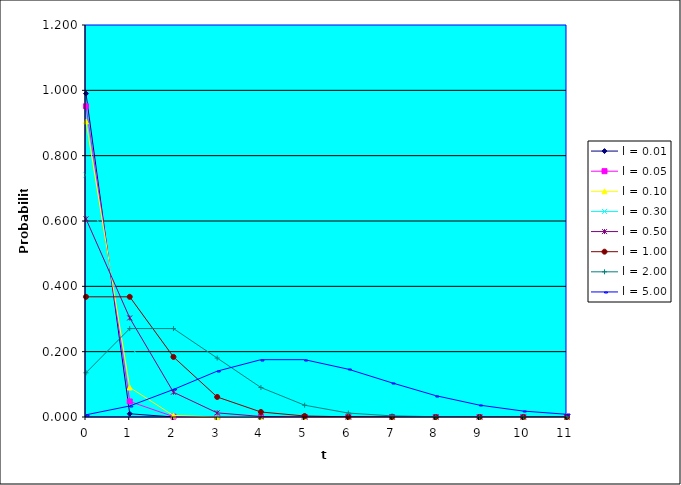
| Category | l = 0.01 | l = 0.05 | l = 0.10 | l = 0.30 | l = 0.50 | l = 1.00 | l = 2.00 | l = 5.00 |
|---|---|---|---|---|---|---|---|---|
| 0.0 | 0.99 | 0.951 | 0.905 | 0.741 | 0.607 | 0.368 | 0.135 | 0.007 |
| 1.0 | 0.01 | 0.048 | 0.09 | 0.222 | 0.303 | 0.368 | 0.271 | 0.034 |
| 2.0 | 0 | 0.001 | 0.005 | 0.033 | 0.076 | 0.184 | 0.271 | 0.084 |
| 3.0 | 0 | 0 | 0 | 0.003 | 0.013 | 0.061 | 0.18 | 0.14 |
| 4.0 | 0 | 0 | 0 | 0 | 0.002 | 0.015 | 0.09 | 0.175 |
| 5.0 | 0 | 0 | 0 | 0 | 0 | 0.003 | 0.036 | 0.175 |
| 6.0 | 0 | 0 | 0 | 0 | 0 | 0.001 | 0.012 | 0.146 |
| 7.0 | 0 | 0 | 0 | 0 | 0 | 0 | 0.003 | 0.104 |
| 8.0 | 0 | 0 | 0 | 0 | 0 | 0 | 0.001 | 0.065 |
| 9.0 | 0 | 0 | 0 | 0 | 0 | 0 | 0 | 0.036 |
| 10.0 | 0 | 0 | 0 | 0 | 0 | 0 | 0 | 0.018 |
| 11.0 | 0 | 0 | 0 | 0 | 0 | 0 | 0 | 0.008 |